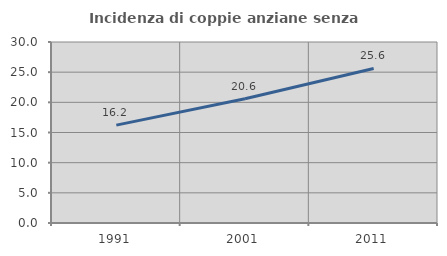
| Category | Incidenza di coppie anziane senza figli  |
|---|---|
| 1991.0 | 16.22 |
| 2001.0 | 20.593 |
| 2011.0 | 25.615 |